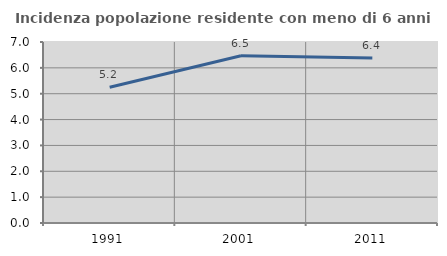
| Category | Incidenza popolazione residente con meno di 6 anni |
|---|---|
| 1991.0 | 5.249 |
| 2001.0 | 6.469 |
| 2011.0 | 6.379 |